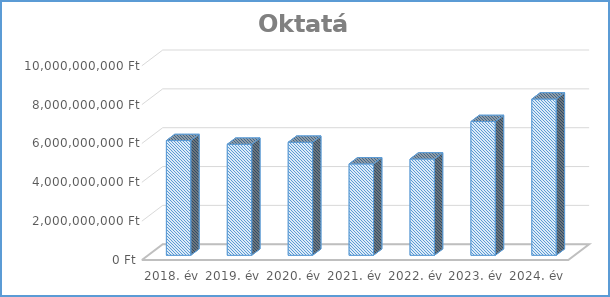
| Category | Oktatás |
|---|---|
| 2018. év | 5905825500 |
| 2019. év | 5715781299 |
| 2020. év | 5818758493 |
| 2021. év | 4704822109 |
| 2022. év | 4956244315 |
| 2023. év | 6885533418 |
| 2024. év | 8044001656 |